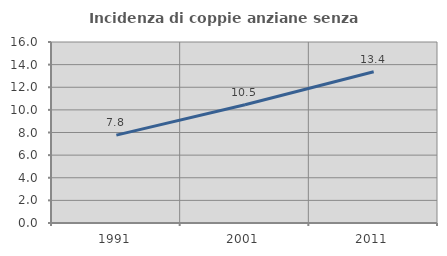
| Category | Incidenza di coppie anziane senza figli  |
|---|---|
| 1991.0 | 7.766 |
| 2001.0 | 10.451 |
| 2011.0 | 13.376 |